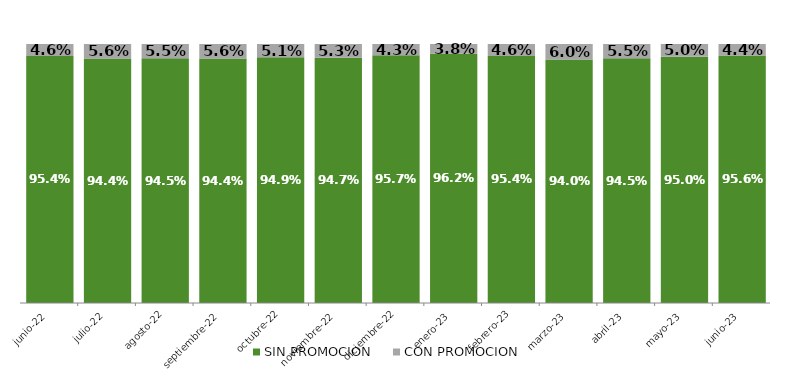
| Category | SIN PROMOCION   | CON PROMOCION   |
|---|---|---|
| 2022-06-01 | 0.954 | 0.046 |
| 2022-07-01 | 0.944 | 0.056 |
| 2022-08-01 | 0.945 | 0.055 |
| 2022-09-01 | 0.944 | 0.056 |
| 2022-10-01 | 0.949 | 0.051 |
| 2022-11-01 | 0.947 | 0.053 |
| 2022-12-01 | 0.957 | 0.043 |
| 2023-01-01 | 0.962 | 0.038 |
| 2023-02-01 | 0.954 | 0.046 |
| 2023-03-01 | 0.94 | 0.06 |
| 2023-04-01 | 0.945 | 0.055 |
| 2023-05-01 | 0.95 | 0.05 |
| 2023-06-01 | 0.956 | 0.044 |